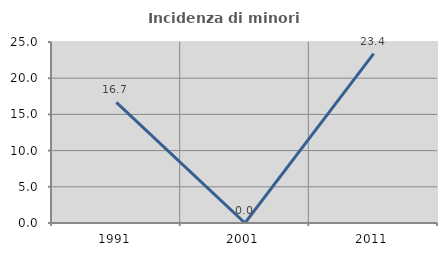
| Category | Incidenza di minori stranieri |
|---|---|
| 1991.0 | 16.667 |
| 2001.0 | 0 |
| 2011.0 | 23.404 |